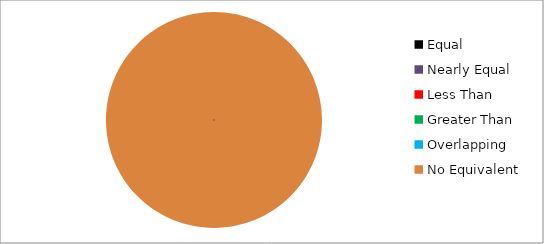
| Category | Series 0 |
|---|---|
| Equal | 0 |
| Nearly Equal | 0 |
| Less Than | 0 |
| Greater Than | 0 |
| Overlapping | 0 |
| No Equivalent | 5 |